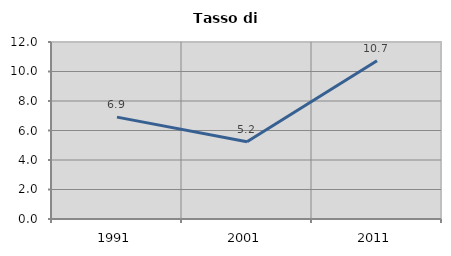
| Category | Tasso di disoccupazione   |
|---|---|
| 1991.0 | 6.905 |
| 2001.0 | 5.236 |
| 2011.0 | 10.733 |